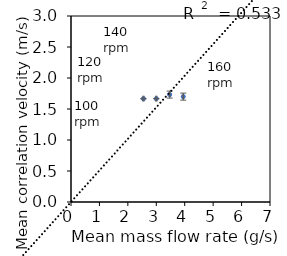
| Category | Series 0 |
|---|---|
| 2.548033333333333 | 1.667 |
| 3.0005666666666664 | 1.667 |
| 3.4709 | 1.732 |
| 3.9486666666666665 | 1.699 |